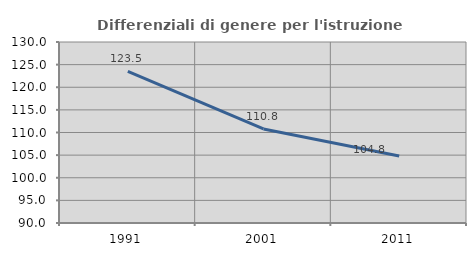
| Category | Differenziali di genere per l'istruzione superiore |
|---|---|
| 1991.0 | 123.487 |
| 2001.0 | 110.783 |
| 2011.0 | 104.789 |